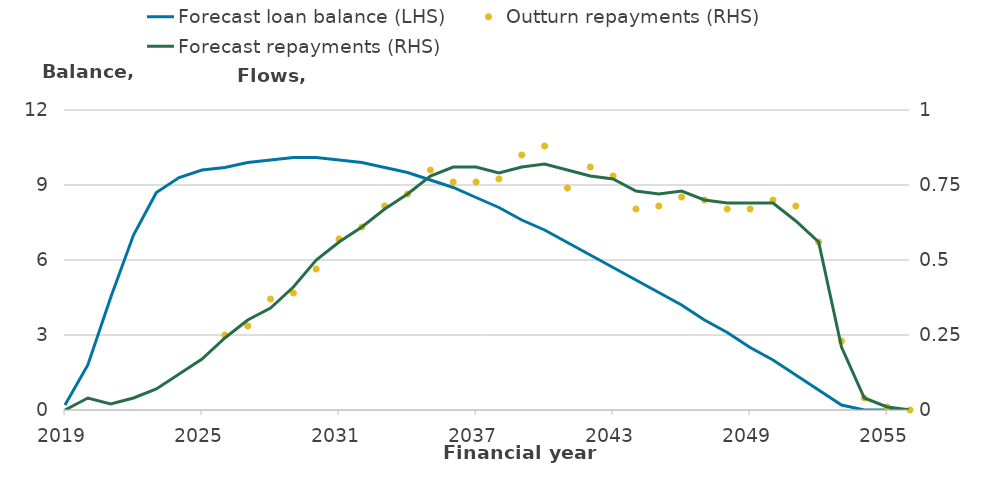
| Category | Forecast loan balance (LHS) |
|---|---|
| 2019.0 | 0.2 |
| 2020.0 | 1.8 |
| 2021.0 | 4.5 |
| 2022.0 | 7 |
| 2023.0 | 8.7 |
| 2024.0 | 9.3 |
| 2025.0 | 9.6 |
| 2026.0 | 9.7 |
| 2027.0 | 9.9 |
| 2028.0 | 10 |
| 2029.0 | 10.1 |
| 2030.0 | 10.1 |
| 2031.0 | 10 |
| 2032.0 | 9.9 |
| 2033.0 | 9.7 |
| 2034.0 | 9.5 |
| 2035.0 | 9.2 |
| 2036.0 | 8.9 |
| 2037.0 | 8.5 |
| 2038.0 | 8.1 |
| 2039.0 | 7.6 |
| 2040.0 | 7.2 |
| 2041.0 | 6.7 |
| 2042.0 | 6.2 |
| 2043.0 | 5.7 |
| 2044.0 | 5.2 |
| 2045.0 | 4.7 |
| 2046.0 | 4.2 |
| 2047.0 | 3.6 |
| 2048.0 | 3.1 |
| 2049.0 | 2.5 |
| 2050.0 | 2 |
| 2051.0 | 1.4 |
| 2052.0 | 0.8 |
| 2053.0 | 0.2 |
| 2054.0 | 0 |
| 2055.0 | 0 |
| 2056.0 | 0 |